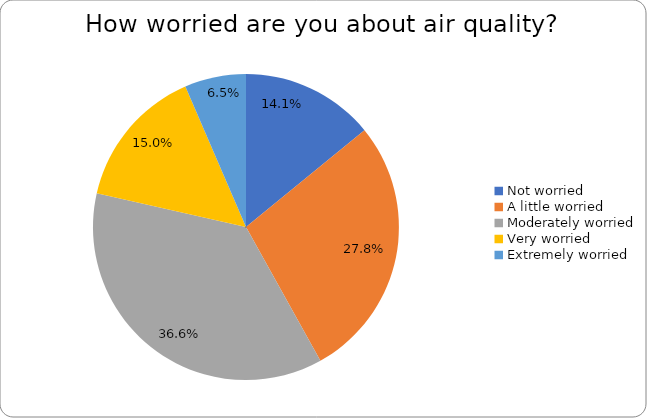
| Category | Series 0 |
|---|---|
| Not worried | 0.141 |
| A little worried | 0.278 |
| Moderately worried | 0.366 |
| Very worried | 0.15 |
| Extremely worried | 0.065 |